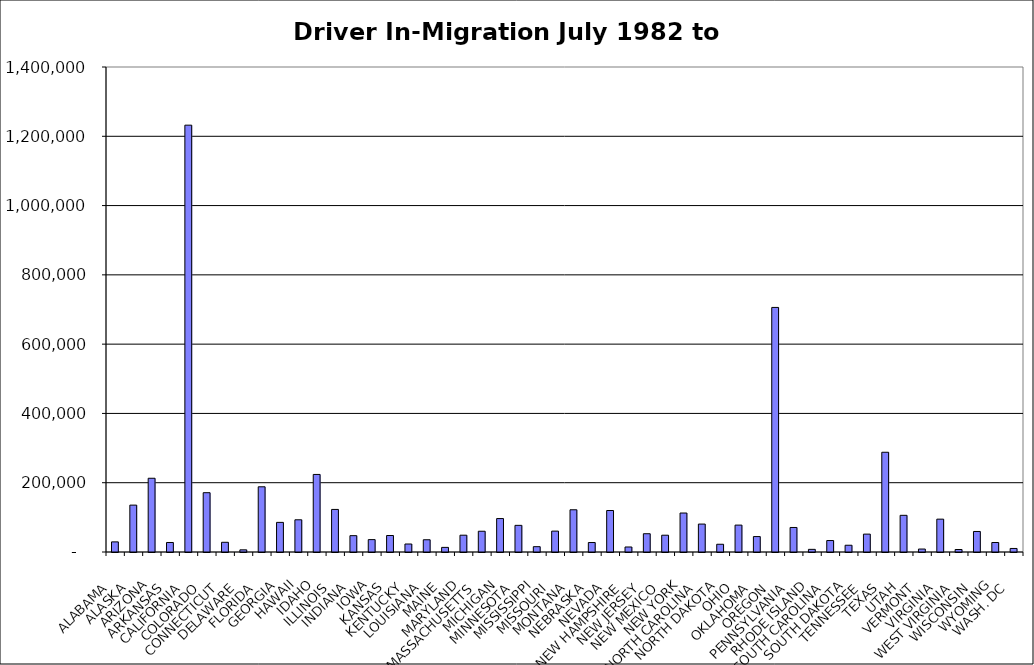
| Category | Series 0 |
|---|---|
|  ALABAMA  | 29202.5 |
|  ALASKA  | 135343.5 |
|  ARIZONA  | 212851 |
|  ARKANSAS  | 27436.5 |
|  CALIFORNIA  | 1232110.5 |
|  COLORADO  | 171179 |
|  CONNECTICUT  | 28031 |
|  DELAWARE  | 6243.5 |
|  FLORIDA  | 188231 |
|  GEORGIA  | 85483 |
|  HAWAII  | 92963.5 |
|  IDAHO  | 223870.5 |
|  ILLINOIS  | 122879.5 |
|  INDIANA  | 47158 |
|  IOWA  | 35758.5 |
|  KANSAS  | 47589.5 |
|  KENTUCKY  | 23087 |
|  LOUISIANA  | 35342.5 |
|  MAINE  | 13318.5 |
|  MARYLAND  | 48513 |
|  MASSACHUSETTS  | 59936 |
|  MICHIGAN  | 96537 |
|  MINNESOTA  | 76938.5 |
|  MISSISSIPPI  | 15360 |
|  MISSOURI  | 60268 |
|  MONTANA  | 121911 |
|  NEBRASKA  | 27369.5 |
|  NEVADA  | 119765 |
|  NEW HAMPSHIRE  | 14477.5 |
|  NEW JERSEY  | 52741 |
|  NEW MEXICO  | 48442 |
|  NEW YORK  | 112518 |
|  NORTH CAROLINA  | 80616.5 |
|  NORTH DAKOTA  | 22360.5 |
|  OHIO  | 77641.5 |
|  OKLAHOMA  | 44558 |
|  OREGON  | 705992 |
|  PENNSYLVANIA  | 70785.5 |
|  RHODE ISLAND  | 7625 |
|  SOUTH CAROLINA  | 33078.5 |
|  SOUTH DAKOTA  | 19520.5 |
|  TENNESSEE  | 51632.5 |
|  TEXAS  | 287924 |
|  UTAH  | 105868.5 |
|  VERMONT  | 8531 |
|  VIRGINIA  | 94848 |
|  WEST VIRGINIA  | 7173.5 |
|  WISCONSIN  | 59238.5 |
|  WYOMING  | 27412 |
|  WASH. DC  | 10205 |